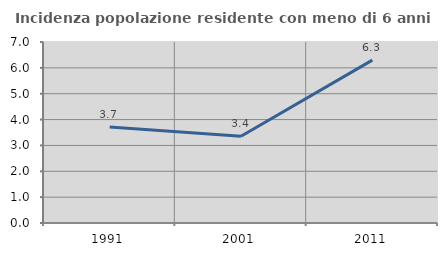
| Category | Incidenza popolazione residente con meno di 6 anni |
|---|---|
| 1991.0 | 3.715 |
| 2001.0 | 3.356 |
| 2011.0 | 6.298 |